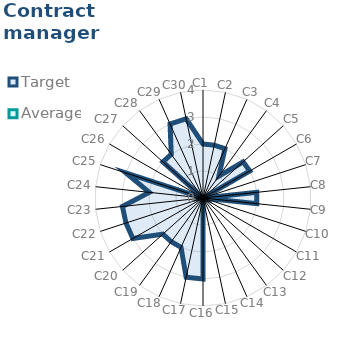
| Category | Target | Average |
|---|---|---|
| C1 | 2 | 0 |
| C2 | 2 | 0 |
| C3 | 2 | 0 |
| C4 | 1 | 0 |
| C5 | 2 | 0 |
| C6 | 2 | 0 |
| C7 | 0 | 0 |
| C8 | 2 | 0 |
| C9 | 2 | 0 |
| C10 | 0 | 0 |
| C11 | 0 | 0 |
| C12 | 0 | 0 |
| C13 | 0 | 0 |
| C14 | 0 | 0 |
| C15 | 0 | 0 |
| C16 | 3 | 0 |
| C17 | 3 | 0 |
| C18 | 2 | 0 |
| C19 | 2 | 0 |
| C20 | 2 | 0 |
| C21 | 3 | 0 |
| C22 | 3 | 0 |
| C23 | 3 | 0 |
| C24 | 2 | 0 |
| C25 | 3 | 0 |
| C26 | 0 | 0 |
| C27 | 2 | 0 |
| C28 | 2 | 0 |
| C29 | 3 | 0 |
| C30 | 3 | 0 |